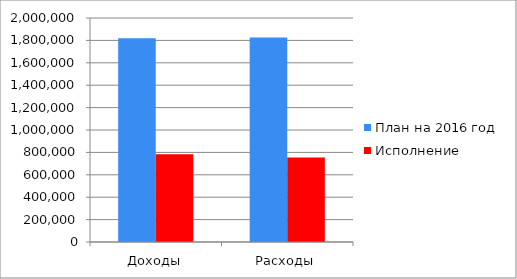
| Category | План на 2016 год | Исполнение |
|---|---|---|
| Доходы | 1819234 | 783707 |
| Расходы | 1826460 | 754674 |